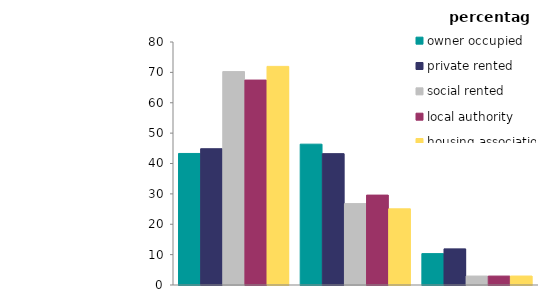
| Category | owner occupied | private rented | social rented | local authority | housing association |
|---|---|---|---|---|---|
| 0 | 43.304 | 44.866 | 70.256 | 67.467 | 71.974 |
| 1 | 46.364 | 43.244 | 26.799 | 29.595 | 25.075 |
| 2 | 10.332 | 11.89 | 2.946 | 2.938 | 2.951 |